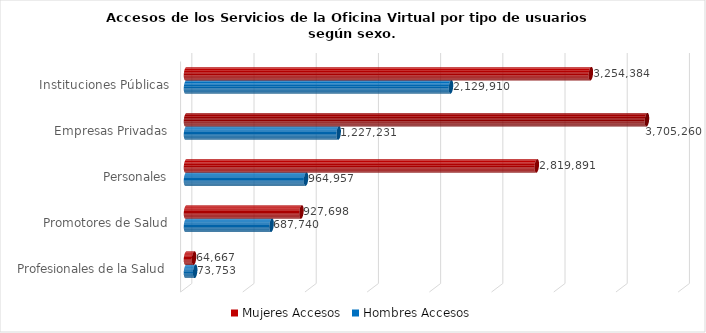
| Category | Mujeres | Hombres |
|---|---|---|
| Instituciones Públicas | 3254384 | 2129910 |
| Empresas Privadas | 3705260 | 1227231 |
| Personales | 2819891 | 964957 |
| Promotores de Salud | 927698 | 687740 |
| Profesionales de la Salud | 64667 | 73753 |